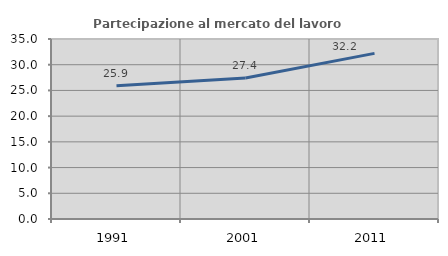
| Category | Partecipazione al mercato del lavoro  femminile |
|---|---|
| 1991.0 | 25.92 |
| 2001.0 | 27.433 |
| 2011.0 | 32.209 |